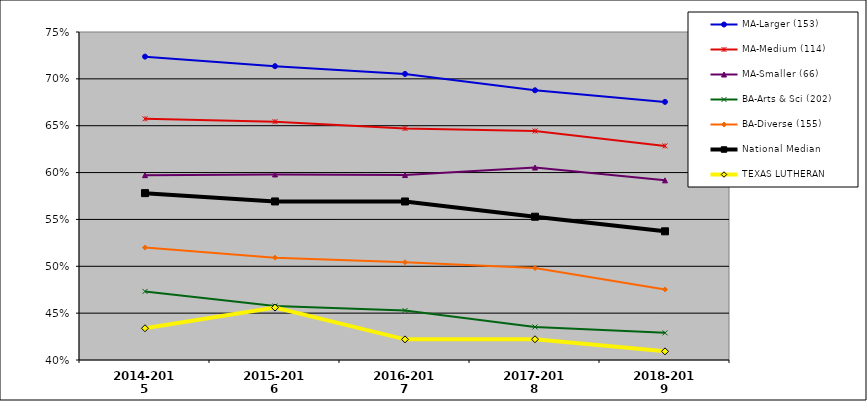
| Category | MA-Larger (153) | MA-Medium (114) | MA-Smaller (66) | BA-Arts & Sci (202) | BA-Diverse (155) | National Median |  TEXAS LUTHERAN  |
|---|---|---|---|---|---|---|---|
| 2014-2015 | 0.724 | 0.657 | 0.597 | 0.473 | 0.52 | 0.578 | 0.434 |
| 2015-2016 | 0.714 | 0.654 | 0.598 | 0.458 | 0.509 | 0.569 | 0.456 |
| 2016-2017 | 0.705 | 0.647 | 0.597 | 0.453 | 0.504 | 0.569 | 0.422 |
| 2017-2018 | 0.688 | 0.644 | 0.605 | 0.435 | 0.498 | 0.553 | 0.422 |
| 2018-2019 | 0.675 | 0.628 | 0.592 | 0.429 | 0.475 | 0.537 | 0.409 |